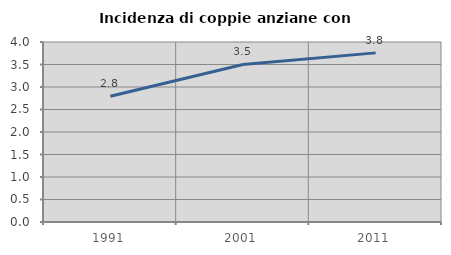
| Category | Incidenza di coppie anziane con figli |
|---|---|
| 1991.0 | 2.794 |
| 2001.0 | 3.501 |
| 2011.0 | 3.758 |